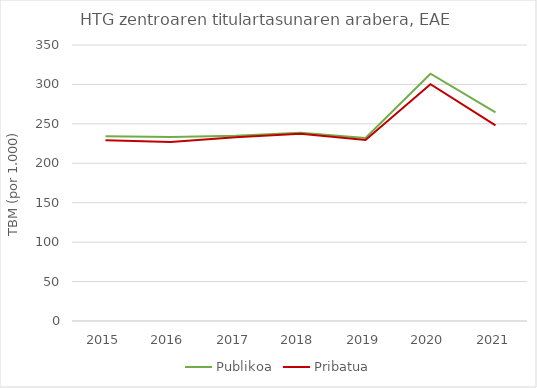
| Category | Publikoa | Pribatua |
|---|---|---|
| 2015.0 | 234.312 | 229.104 |
| 2016.0 | 233.314 | 226.897 |
| 2017.0 | 234.767 | 232.866 |
| 2018.0 | 238.679 | 237.304 |
| 2019.0 | 231.993 | 229.584 |
| 2020.0 | 313.548 | 300.357 |
| 2021.0 | 264.444 | 248.144 |